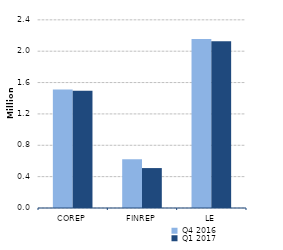
| Category | Q4 2016 | Q1 2017 |
|---|---|---|
| 0 | 1512683 | 1494268 |
| 1/1/00 | 621754 | 509262 |
| 1/2/00 | 2154895 | 2126010 |